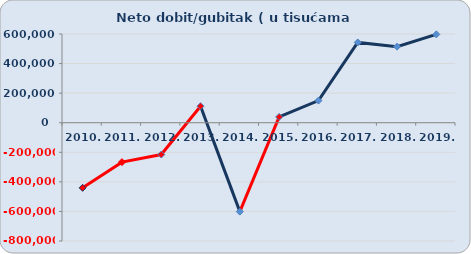
| Category | Neto dobit/gubitak |
|---|---|
| 2010. | -440404.498 |
| 2011. | -266583 |
| 2012. | -215081.861 |
| 2013. | 111684.807 |
| 2014. | -601309.055 |
| 2015. | 39242.47 |
| 2016. | 149817.077 |
| 2017. | 542875.342 |
| 2018. | 514368.533 |
| 2019. | 597616.465 |